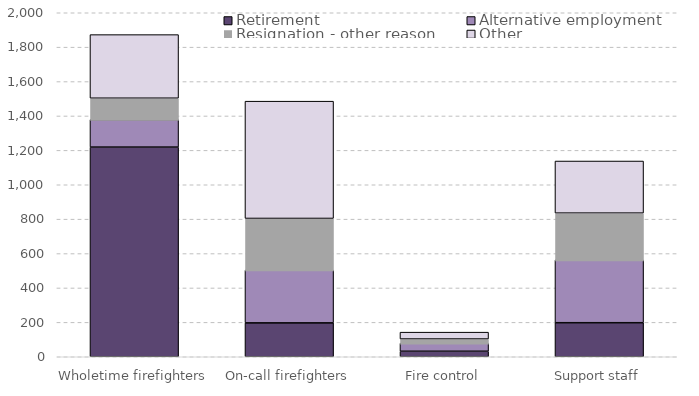
| Category | Retirement | Alternative employment | Resignation - other reason | Other |
|---|---|---|---|---|
| Wholetime firefighters | 1219 | 160 | 124 | 370 |
| On-call firefighters | 197 | 307 | 300 | 682 |
| Fire control | 32 | 47 | 24 | 40 |
| Support staff | 198 | 365 | 272 | 303 |